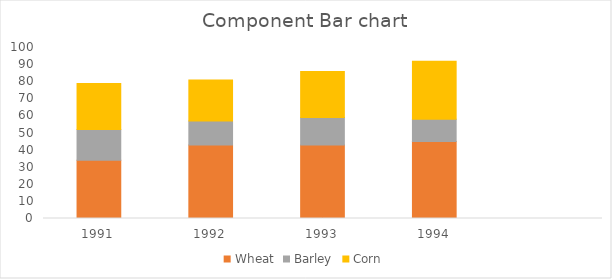
| Category | Wheat | Barley | Corn |
|---|---|---|---|
| 1991.0 | 34 | 18 | 27 |
| 1992.0 | 43 | 14 | 24 |
| 1993.0 | 43 | 16 | 27 |
| 1994.0 | 45 | 13 | 34 |